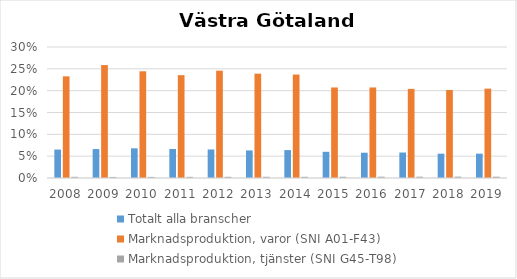
| Category | Totalt alla branscher | Marknadsproduktion, varor (SNI A01-F43) | Marknadsproduktion, tjänster (SNI G45-T98) |
|---|---|---|---|
| 2008 | 0.065 | 0.233 | 0.003 |
| 2009 | 0.066 | 0.259 | 0.002 |
| 2010 | 0.068 | 0.244 | 0.003 |
| 2011 | 0.066 | 0.236 | 0.003 |
| 2012 | 0.065 | 0.246 | 0.003 |
| 2013 | 0.063 | 0.239 | 0.003 |
| 2014 | 0.064 | 0.237 | 0.003 |
| 2015 | 0.06 | 0.207 | 0.003 |
| 2016 | 0.058 | 0.207 | 0.003 |
| 2017 | 0.058 | 0.204 | 0.003 |
| 2018 | 0.056 | 0.201 | 0.003 |
| 2019 | 0.056 | 0.205 | 0.003 |